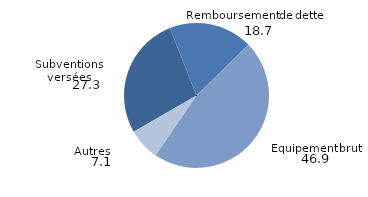
| Category | Series 0 |
|---|---|
| 0 | 27.341 |
| 1 | 18.677 |
| 2 | 46.859 |
| 3 | 7.124 |